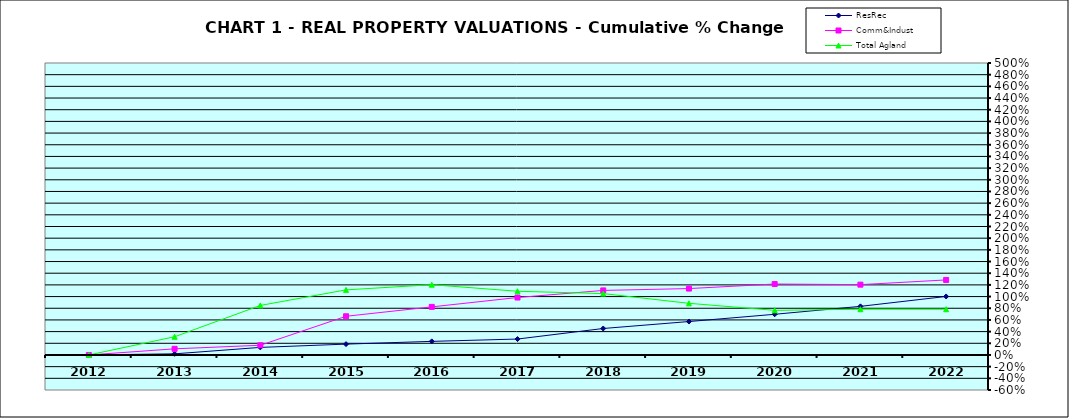
| Category | ResRec | Comm&Indust | Total Agland |
|---|---|---|---|
| 2012.0 | 0 | 0 | 0 |
| 2013.0 | 0.019 | 0.105 | 0.312 |
| 2014.0 | 0.129 | 0.166 | 0.848 |
| 2015.0 | 0.186 | 0.663 | 1.115 |
| 2016.0 | 0.233 | 0.824 | 1.203 |
| 2017.0 | 0.273 | 0.984 | 1.091 |
| 2018.0 | 0.453 | 1.105 | 1.051 |
| 2019.0 | 0.572 | 1.137 | 0.884 |
| 2020.0 | 0.697 | 1.215 | 0.764 |
| 2021.0 | 0.832 | 1.204 | 0.784 |
| 2022.0 | 1.002 | 1.285 | 0.784 |